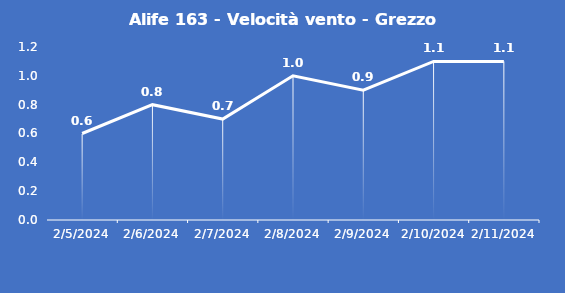
| Category | Alife 163 - Velocità vento - Grezzo (m/s) |
|---|---|
| 2/5/24 | 0.6 |
| 2/6/24 | 0.8 |
| 2/7/24 | 0.7 |
| 2/8/24 | 1 |
| 2/9/24 | 0.9 |
| 2/10/24 | 1.1 |
| 2/11/24 | 1.1 |